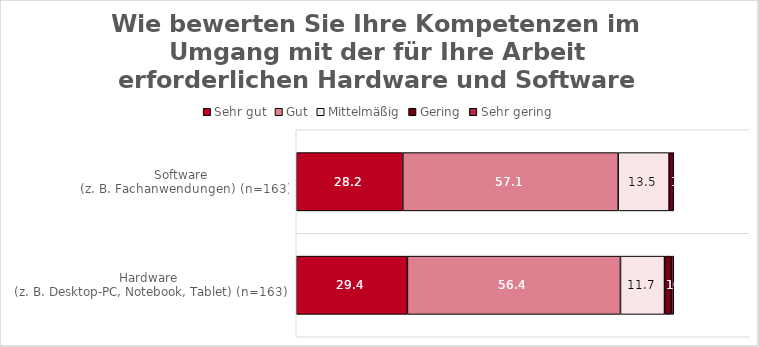
| Category | Sehr gut | Gut | Mittelmäßig | Gering | Sehr gering |
|---|---|---|---|---|---|
| Hardware 
(z. B. Desktop-PC, Notebook, Tablet) (n=163) | 29.448 | 56.442 | 11.656 | 1.84 | 0.613 |
| Software 
(z. B. Fachanwendungen) (n=163) | 28.221 | 57.055 | 13.497 | 1.227 | 0 |